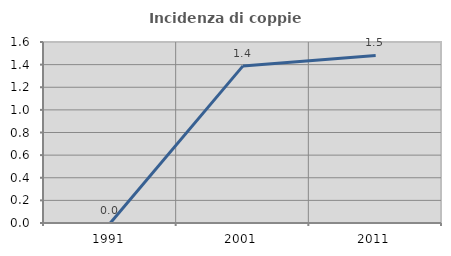
| Category | Incidenza di coppie miste |
|---|---|
| 1991.0 | 0 |
| 2001.0 | 1.389 |
| 2011.0 | 1.481 |